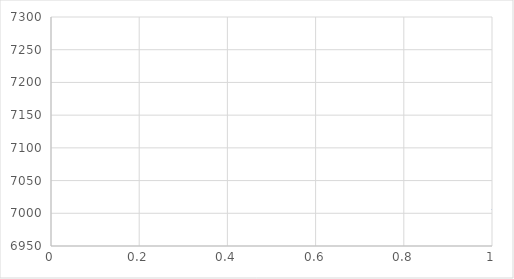
| Category | Series 0 |
|---|---|
| 0 | 7005 |
| 1 | 7252 |